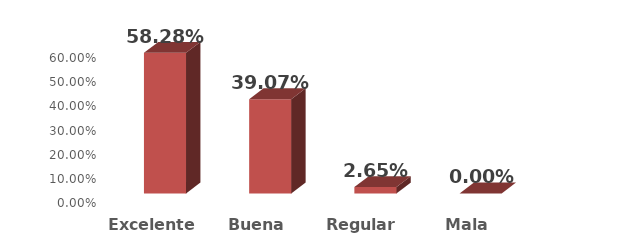
| Category | Series 0 |
|---|---|
| Excelente | 0.583 |
| Buena | 0.391 |
| Regular | 0.026 |
| Mala | 0 |